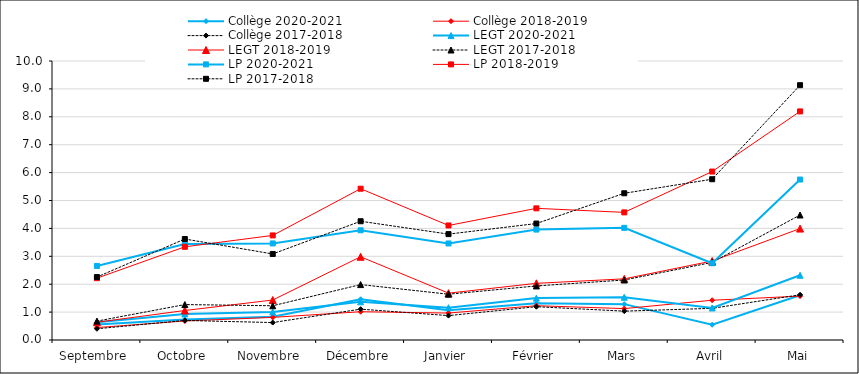
| Category | Collège | LEGT | LP |
|---|---|---|---|
| Septembre | 0.403 | 0.677 | 2.256 |
| Octobre | 0.7 | 1.27 | 3.62 |
| Novembre | 0.625 | 1.227 | 3.084 |
| Décembre | 1.105 | 1.986 | 4.256 |
| Janvier | 0.875 | 1.641 | 3.795 |
| Février | 1.194 | 1.938 | 4.174 |
| Mars | 1.034 | 2.151 | 5.259 |
| Avril | 1.135 | 2.781 | 5.763 |
| Mai | 1.621 | 4.48 | 9.133 |